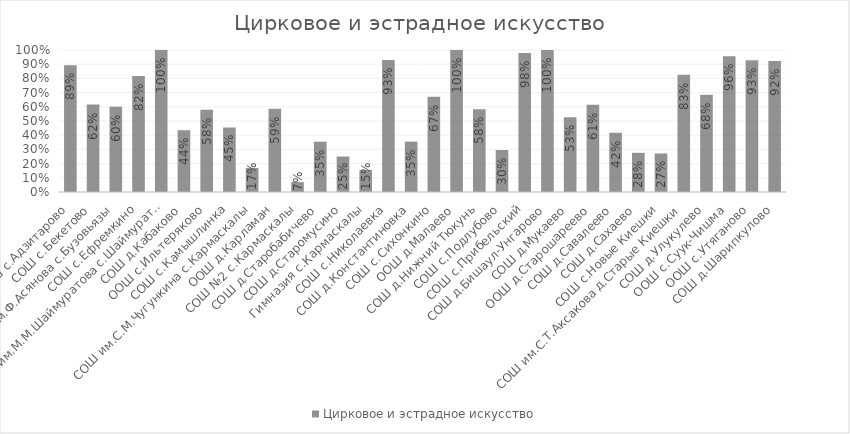
| Category | Цирковое и эстрадное искусство |
|---|---|
| СОШ с.Адзитарово | 0.893 |
| СОШ с.Бекетово | 0.616 |
| СОШ им.Ф.Асянова с.Бузовьязы | 0.6 |
| СОШ с.Ефремкино | 0.816 |
| СОШ им.М.М.Шаймуратова с.Шаймуратово | 1 |
| СОШ д.Кабаково | 0.435 |
| ООШ с.Ильтеряково | 0.579 |
| СОШ с.Камышлинка | 0.455 |
| СОШ им.С.М.Чугункина с.Кармаскалы | 0.17 |
| ООШ д.Карламан | 0.587 |
| СОШ №2 с.Кармаскалы | 0.069 |
| СОШ д.Старобабичево | 0.354 |
| СОШ д.Старомусино | 0.25 |
| Гимназия с.Кармаскалы | 0.154 |
| СОШ с.Николаевка | 0.929 |
| СОШ д.Константиновка | 0.355 |
| СОШ с.Сихонкино | 0.67 |
| ООШ д.Малаево | 1 |
| СОШ д.Нижний Тюкунь | 0.583 |
| СОШ с.Подлубово | 0.295 |
| СОШ с.Прибельский | 0.98 |
| СОШ д.Бишаул-Унгарово | 1 |
| СОШ д.Мукаево | 0.526 |
| ООШ д.Старошареево | 0.614 |
| СОШ д.Савалеево | 0.417 |
| СОШ д.Сахаево | 0.276 |
| СОШ с.Новые Киешки | 0.271 |
| СОШ им.С.Т.Аксакова д.Старые Киешки | 0.827 |
| СОШ д.Улукулево | 0.684 |
| ООШ с.Суук-Чишма | 0.956 |
| ООШ с.Утяганово | 0.929 |
| СОШ д.Шарипкулово | 0.923 |